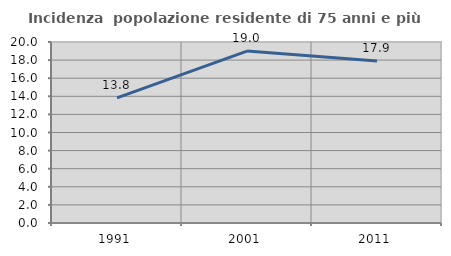
| Category | Incidenza  popolazione residente di 75 anni e più |
|---|---|
| 1991.0 | 13.832 |
| 2001.0 | 19 |
| 2011.0 | 17.892 |